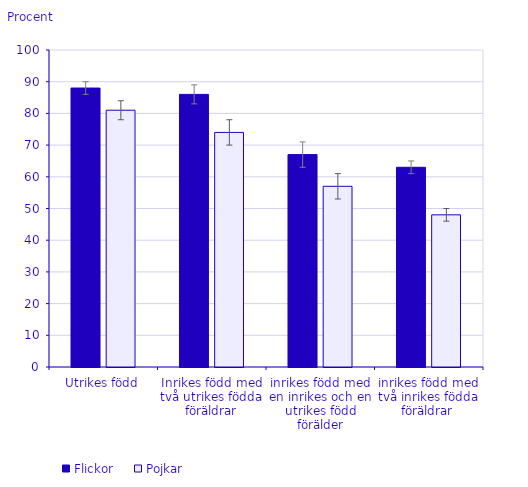
| Category | Flickor | Pojkar |
|---|---|---|
| Utrikes född | 88 | 81 |
| Inrikes född med två utrikes födda föräldrar | 86 | 74 |
| inrikes född med en inrikes och en utrikes född förälder | 67 | 57 |
| inrikes född med två inrikes födda föräldrar  | 63 | 48 |